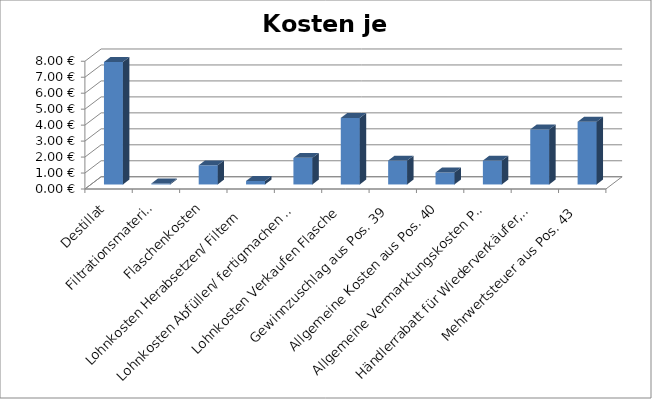
| Category | Kosten je Flasche |
|---|---|
| Destillat | 7.671 |
| Filtrationsmaterial | 0.06 |
| Flaschenkosten | 1.2 |
| Lohnkosten Herabsetzen/ Filtern  | 0.216 |
| Lohnkosten Abfüllen/ fertigmachen Flasche | 1.667 |
| Lohnkosten Verkaufen Flasche | 4.167 |
| Gewinnzuschlag aus Pos. 39 | 1.498 |
| Allgemeine Kosten aus Pos. 40 | 0.749 |
| Allgemeine Vermarktungskosten Pos. 41 | 1.498 |
| Händlerrabatt für Wiederverkäufer, Handelsvertreter Pos. 42 | 3.446 |
| Mehrwertsteuer aus Pos. 43 | 3.928 |